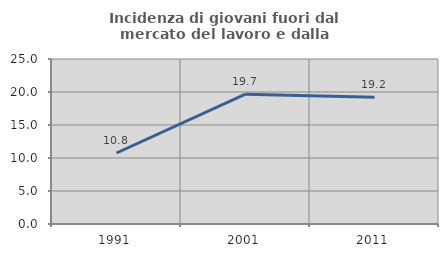
| Category | Incidenza di giovani fuori dal mercato del lavoro e dalla formazione  |
|---|---|
| 1991.0 | 10.757 |
| 2001.0 | 19.672 |
| 2011.0 | 19.205 |